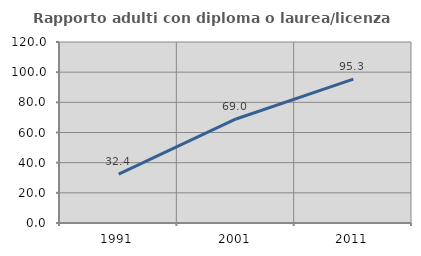
| Category | Rapporto adulti con diploma o laurea/licenza media  |
|---|---|
| 1991.0 | 32.367 |
| 2001.0 | 68.966 |
| 2011.0 | 95.349 |